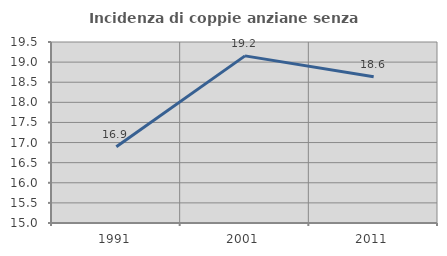
| Category | Incidenza di coppie anziane senza figli  |
|---|---|
| 1991.0 | 16.894 |
| 2001.0 | 19.155 |
| 2011.0 | 18.634 |